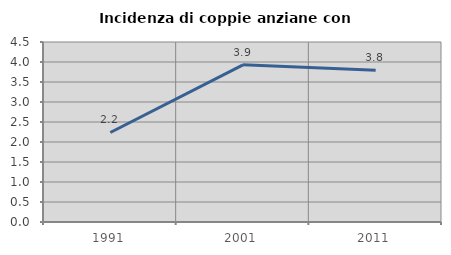
| Category | Incidenza di coppie anziane con figli |
|---|---|
| 1991.0 | 2.238 |
| 2001.0 | 3.929 |
| 2011.0 | 3.796 |